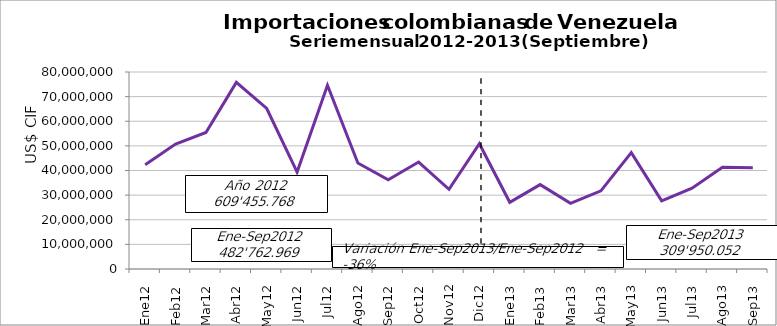
| Category | Series 0 |
|---|---|
| 0 | 42381451.25 |
| 1 | 50721196.14 |
| 2 | 55434618.46 |
| 3 | 75791616.05 |
| 4 | 65183320.3 |
| 5 | 39344207.18 |
| 6 | 74624396.93 |
| 7 | 43036332.92 |
| 8 | 36245829.91 |
| 9 | 43444361.9 |
| 10 | 32369651.57 |
| 11 | 50878784.91 |
| 12 | 27091216.42 |
| 13 | 34271115.08 |
| 14 | 26652001.77 |
| 15 | 31732079.91 |
| 16 | 47272221.82 |
| 17 | 27688818.05 |
| 18 | 32811108.91 |
| 19 | 41284495.61 |
| 20 | 41146994.29 |